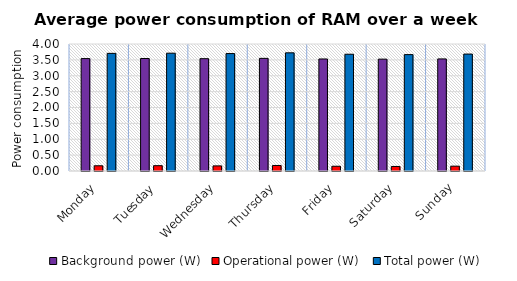
| Category | Background power (W) | Operational power (W) | Total power (W) |
|---|---|---|---|
| Monday | 3.541 | 0.165 | 3.705 |
| Tuesday | 3.543 | 0.168 | 3.71 |
| Wednesday | 3.537 | 0.161 | 3.698 |
| Thursday | 3.548 | 0.174 | 3.722 |
| Friday | 3.528 | 0.149 | 3.677 |
| Saturday | 3.523 | 0.143 | 3.666 |
| Sunday | 3.53 | 0.152 | 3.683 |